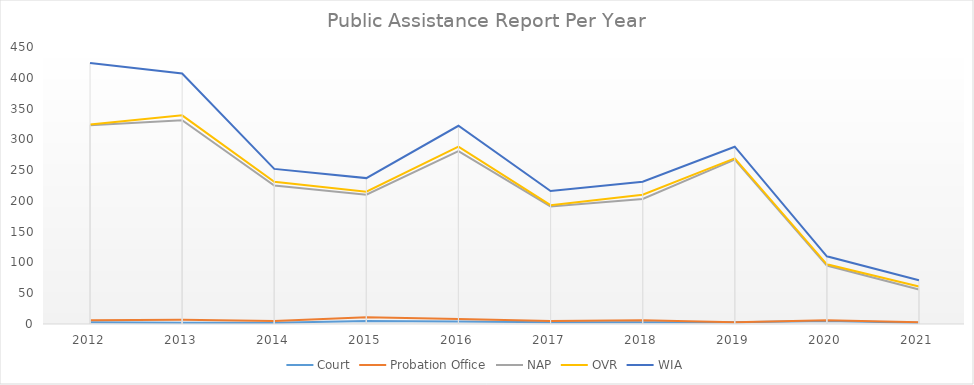
| Category | Court | Probation Office | NAP | OVR | WIA |
|---|---|---|---|---|---|
| 2012.0 | 3 | 3 | 317 | 1 | 100 |
| 2013.0 | 2 | 5 | 324 | 8 | 68 |
| 2014.0 | 2 | 3 | 220 | 6 | 21 |
| 2015.0 | 5 | 6 | 199 | 5 | 22 |
| 2016.0 | 4 | 4 | 273 | 7 | 34 |
| 2017.0 | 3 | 2 | 186 | 2 | 23 |
| 2018.0 | 3 | 3 | 197 | 7 | 21 |
| 2019.0 | 3 | 0 | 264 | 2 | 19 |
| 2020.0 | 5 | 1 | 89 | 2 | 13 |
| 2021.0 | 2 | 1 | 53 | 5 | 10 |